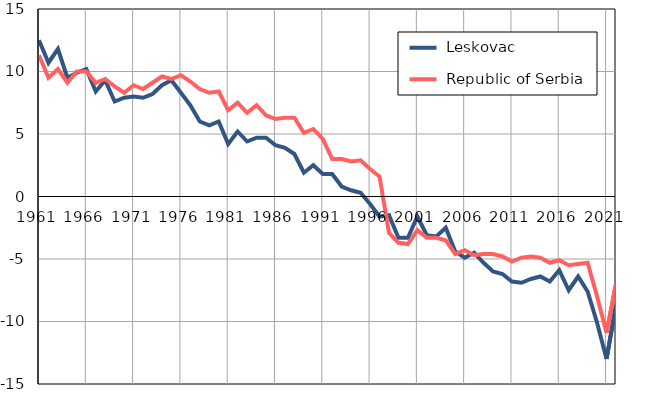
| Category |  Leskovac |  Republic of Serbia |
|---|---|---|
| 1961.0 | 12.5 | 11.3 |
| 1962.0 | 10.7 | 9.5 |
| 1963.0 | 11.8 | 10.2 |
| 1964.0 | 9.5 | 9.1 |
| 1965.0 | 9.9 | 10 |
| 1966.0 | 10.2 | 10 |
| 1967.0 | 8.4 | 9.1 |
| 1968.0 | 9.3 | 9.4 |
| 1969.0 | 7.6 | 8.8 |
| 1970.0 | 7.9 | 8.3 |
| 1971.0 | 8 | 8.9 |
| 1972.0 | 7.9 | 8.6 |
| 1973.0 | 8.2 | 9.1 |
| 1974.0 | 8.9 | 9.6 |
| 1975.0 | 9.3 | 9.4 |
| 1976.0 | 8.3 | 9.7 |
| 1977.0 | 7.3 | 9.2 |
| 1978.0 | 6 | 8.6 |
| 1979.0 | 5.7 | 8.3 |
| 1980.0 | 6 | 8.4 |
| 1981.0 | 4.2 | 6.9 |
| 1982.0 | 5.2 | 7.5 |
| 1983.0 | 4.4 | 6.7 |
| 1984.0 | 4.7 | 7.3 |
| 1985.0 | 4.7 | 6.5 |
| 1986.0 | 4.1 | 6.2 |
| 1987.0 | 3.9 | 6.3 |
| 1988.0 | 3.4 | 6.3 |
| 1989.0 | 1.9 | 5.1 |
| 1990.0 | 2.5 | 5.4 |
| 1991.0 | 1.8 | 4.6 |
| 1992.0 | 1.8 | 3 |
| 1993.0 | 0.8 | 3 |
| 1994.0 | 0.5 | 2.8 |
| 1995.0 | 0.3 | 2.9 |
| 1996.0 | -0.6 | 2.2 |
| 1997.0 | -1.6 | 1.6 |
| 1998.0 | -1.5 | -2.9 |
| 1999.0 | -3.3 | -3.7 |
| 2000.0 | -3.3 | -3.8 |
| 2001.0 | -1.6 | -2.7 |
| 2002.0 | -3.1 | -3.3 |
| 2003.0 | -3.2 | -3.3 |
| 2004.0 | -2.5 | -3.5 |
| 2005.0 | -4.4 | -4.6 |
| 2006.0 | -4.9 | -4.3 |
| 2007.0 | -4.5 | -4.7 |
| 2008.0 | -5.3 | -4.6 |
| 2009.0 | -6 | -4.6 |
| 2010.0 | -6.2 | -4.8 |
| 2011.0 | -6.8 | -5.2 |
| 2012.0 | -6.9 | -4.9 |
| 2013.0 | -6.6 | -4.8 |
| 2014.0 | -6.4 | -4.9 |
| 2015.0 | -6.8 | -5.3 |
| 2016.0 | -5.9 | -5.1 |
| 2017.0 | -7.5 | -5.5 |
| 2018.0 | -6.4 | -5.4 |
| 2019.0 | -7.6 | -5.3 |
| 2020.0 | -10.1 | -8 |
| 2021.0 | -13 | -10.9 |
| 2022.0 | -8.7 | -7 |